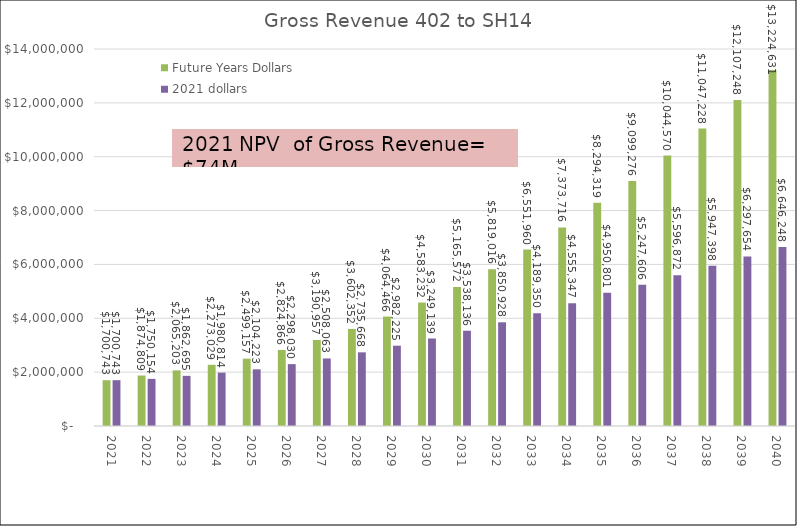
| Category | Future Years Dollars | 2021 dollars |
|---|---|---|
| 2021.0 | 1700743.2 | 1700743.2 |
| 2022.0 | 1874808.6 | 1750153.889 |
| 2023.0 | 2065203.2 | 1862694.962 |
| 2024.0 | 2273029.2 | 1980813.63 |
| 2025.0 | 2499157 | 2104223.134 |
| 2026.0 | 2824866 | 2298030.311 |
| 2027.0 | 3190957 | 2508063.358 |
| 2028.0 | 3602352 | 2735667.738 |
| 2029.0 | 4064466 | 2982224.59 |
| 2030.0 | 4583232 | 3249139.392 |
| 2031.0 | 5165572 | 3538136.4 |
| 2032.0 | 5819016 | 3850927.601 |
| 2033.0 | 6551960 | 4189350.434 |
| 2034.0 | 7373716 | 4555347.471 |
| 2035.0 | 8294319 | 4950801.199 |
| 2036.0 | 9099275.66 | 5247606.065 |
| 2037.0 | 10044570.18 | 5596872.467 |
| 2038.0 | 11047227.52 | 5947397.997 |
| 2039.0 | 12107247.68 | 6297653.776 |
| 2040.0 | 13224630.66 | 6646248.204 |